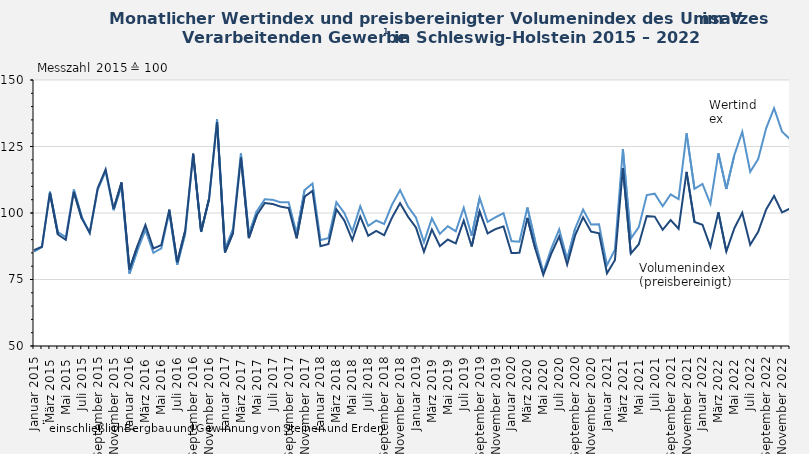
| Category | Wertindex | Volumenindex (preisbereinigt) |
|---|---|---|
| Januar 2015 | 85.433 | 86.048 |
| Februar 2015 | 87.205 | 87.307 |
| März 2015 | 108.016 | 107.594 |
| April 2015 | 92.781 | 91.925 |
| Mai 2015 | 90.926 | 89.957 |
| Juni 2015 | 108.806 | 107.949 |
| Juli 2015 | 98.6 | 97.947 |
| August 2015 | 92.486 | 92.589 |
| September 2015 | 108.723 | 109.3 |
| Oktober 2015 | 115.613 | 116.36 |
| November 2015 | 101.011 | 101.572 |
| Dezember 2015 | 110.407 | 111.476 |
| Januar 2016 | 77.219 | 78.781 |
| Februar 2016 | 85.988 | 87.646 |
| März 2016 | 93.673 | 95.506 |
| April 2016 | 85.042 | 86.663 |
| Mai 2016 | 86.686 | 87.947 |
| Juni 2016 | 100.379 | 101.237 |
| Juli 2016 | 80.551 | 81.516 |
| August 2016 | 92.271 | 93.378 |
| September 2016 | 121.815 | 122.324 |
| Oktober 2016 | 92.879 | 93.078 |
| November 2016 | 105.27 | 105.387 |
| Dezember 2016 | 135.241 | 134.163 |
| Januar 2017 | 86.218 | 85.164 |
| Februar 2017 | 93.867 | 92.424 |
| März 2017 | 122.401 | 120.802 |
| April 2017 | 92.049 | 90.567 |
| Mai 2017 | 100.682 | 99.255 |
| Juni 2017 | 105.171 | 103.753 |
| Juli 2017 | 104.95 | 103.378 |
| August 2017 | 104.004 | 102.379 |
| September 2017 | 103.995 | 101.863 |
| Oktober 2017 | 92.321 | 90.492 |
| November 2017 | 108.617 | 106.155 |
| Dezember 2017 | 111.076 | 108.32 |
| Januar 2018 | 89.822 | 87.524 |
| Februar 2018 | 90.547 | 88.336 |
| März 2018 | 104.062 | 101.378 |
| April 2018 | 100.004 | 97.156 |
| Mai 2018 | 93.076 | 89.824 |
| Juni 2018 | 102.521 | 98.681 |
| Juli 2018 | 95.14 | 91.449 |
| August 2018 | 97.186 | 93.265 |
| September 2018 | 95.885 | 91.647 |
| Oktober 2018 | 103.222 | 98.34 |
| November 2018 | 108.579 | 103.681 |
| Dezember 2018 | 102.417 | 98.593 |
| Januar 2019 | 98.278 | 94.538 |
| Februar 2019 | 89.062 | 85.404 |
| März 2019 | 97.992 | 93.791 |
| April 2019 | 92.173 | 87.551 |
| Mai 2019 | 95.017 | 90.027 |
| Juni 2019 | 93.114 | 88.557 |
| Juli 2019 | 101.934 | 97.154 |
| August 2019 | 91.455 | 87.41 |
| September 2019 | 105.678 | 100.691 |
| Oktober 2019 | 96.651 | 92.334 |
| November 2019 | 98.414 | 93.966 |
| Dezember 2019 | 99.895 | 94.96 |
| Januar 2020 | 89.405 | 84.939 |
| Februar 2020 | 89.216 | 85.033 |
| März 2020 | 102.038 | 98.167 |
| April 2020 | 89.137 | 86.505 |
| Mai 2020 | 77.709 | 76.735 |
| Juni 2020 | 86.594 | 84.705 |
| Juli 2020 | 93.865 | 91.191 |
| August 2020 | 82.652 | 80.623 |
| September 2020 | 94.15 | 91.603 |
| Oktober 2020 | 101.268 | 98.408 |
| November 2020 | 95.664 | 93.006 |
| Dezember 2020 | 95.775 | 92.373 |
| Januar 2021 | 80.406 | 77.315 |
| Februar 2021 | 86.207 | 82.298 |
| März 2021 | 123.991 | 116.924 |
| April 2021 | 90.37 | 84.757 |
| Mai 2021 | 94.692 | 88.248 |
| Juni 2021 | 106.719 | 98.861 |
| Juli 2021 | 107.272 | 98.651 |
| August 2021 | 102.543 | 93.686 |
| September 2021 | 107.004 | 97.341 |
| Oktober 2021 | 105.219 | 94.066 |
| November 2021 | 129.909 | 115.489 |
| Dezember 2021 | 109.055 | 96.617 |
| Januar 2022 | 110.94 | 95.578 |
| Februar 2022 | 103.471 | 87.359 |
| März 2022 | 122.448 | 100.261 |
| April 2022 | 109.038 | 85.536 |
| Mai 2022 | 121.742 | 94.211 |
| Juni 2022 | 130.54 | 100.097 |
| Juli 2022 | 115.468 | 88.057 |
| August 2022 | 120.294 | 92.918 |
| September 2022 | 131.829 | 101.288 |
| Oktober 2022 | 139.391 | 106.41 |
| November 2022 | 130.585 | 100.223 |
| Dezember 2022 | 127.756 | 101.685 |